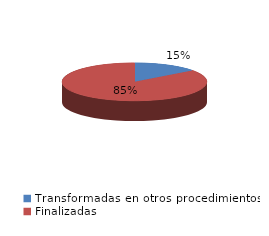
| Category | Series 0 |
|---|---|
| Transformadas en otros procedimientos | 3336 |
| Finalizadas | 19434 |